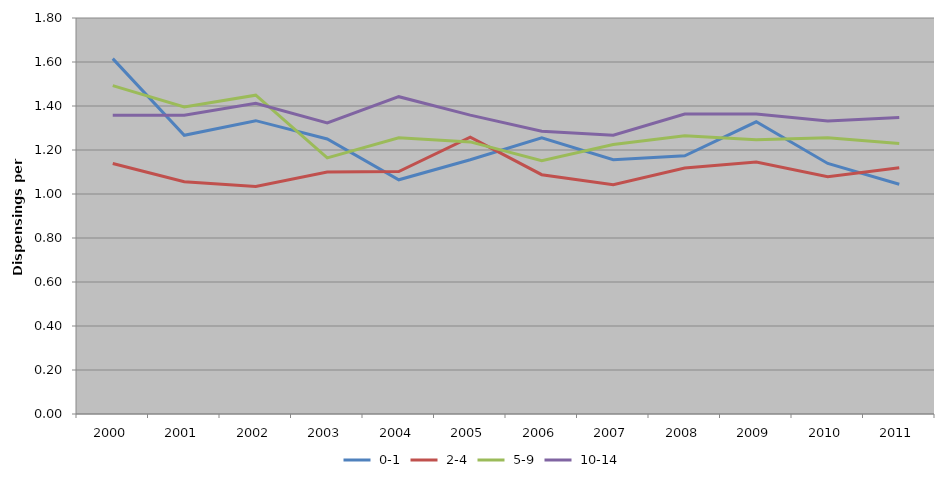
| Category |  0-1 |  2-4 |  5-9 |  10-14 |
|---|---|---|---|---|
| 2000 | 1.615 | 1.139 | 1.493 | 1.358 |
| 2001 | 1.267 | 1.056 | 1.395 | 1.358 |
| 2002 | 1.333 | 1.034 | 1.449 | 1.412 |
| 2003 | 1.25 | 1.1 | 1.164 | 1.323 |
| 2004 | 1.065 | 1.102 | 1.256 | 1.442 |
| 2005 | 1.156 | 1.258 | 1.237 | 1.359 |
| 2006 | 1.255 | 1.088 | 1.151 | 1.285 |
| 2007 | 1.156 | 1.042 | 1.225 | 1.267 |
| 2008 | 1.173 | 1.118 | 1.265 | 1.363 |
| 2009 | 1.328 | 1.145 | 1.246 | 1.363 |
| 2010 | 1.139 | 1.078 | 1.256 | 1.332 |
| 2011 | 1.044 | 1.119 | 1.23 | 1.348 |